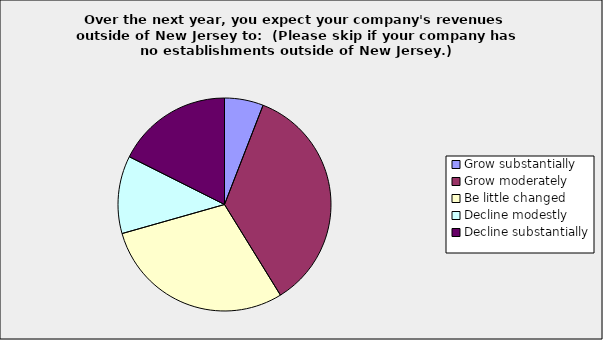
| Category | Series 0 |
|---|---|
| Grow substantially | 0.059 |
| Grow moderately | 0.353 |
| Be little changed | 0.294 |
| Decline modestly | 0.118 |
| Decline substantially | 0.176 |